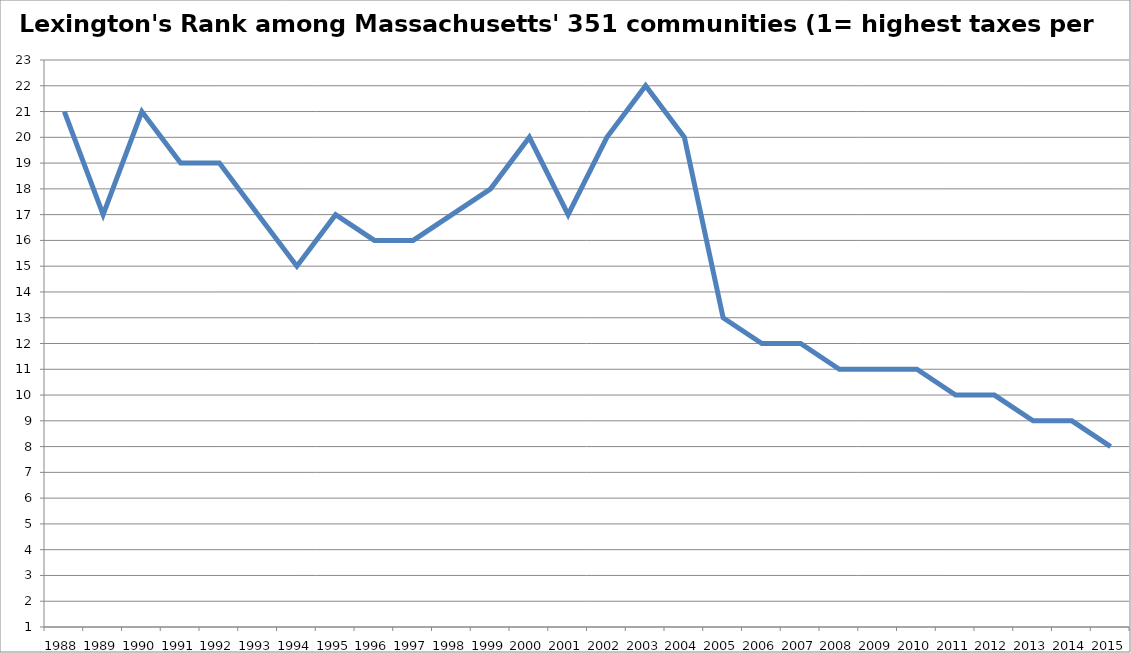
| Category | Lexington's Rank among Massachusetts' 351 communities (1= highest taxes per house) |
|---|---|
| 1988.0 | 21 |
| 1989.0 | 17 |
| 1990.0 | 21 |
| 1991.0 | 19 |
| 1992.0 | 19 |
| 1993.0 | 17 |
| 1994.0 | 15 |
| 1995.0 | 17 |
| 1996.0 | 16 |
| 1997.0 | 16 |
| 1998.0 | 17 |
| 1999.0 | 18 |
| 2000.0 | 20 |
| 2001.0 | 17 |
| 2002.0 | 20 |
| 2003.0 | 22 |
| 2004.0 | 20 |
| 2005.0 | 13 |
| 2006.0 | 12 |
| 2007.0 | 12 |
| 2008.0 | 11 |
| 2009.0 | 11 |
| 2010.0 | 11 |
| 2011.0 | 10 |
| 2012.0 | 10 |
| 2013.0 | 9 |
| 2014.0 | 9 |
| 2015.0 | 8 |